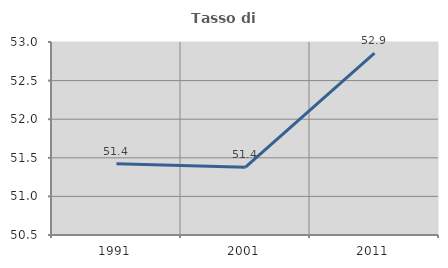
| Category | Tasso di occupazione   |
|---|---|
| 1991.0 | 51.424 |
| 2001.0 | 51.378 |
| 2011.0 | 52.855 |